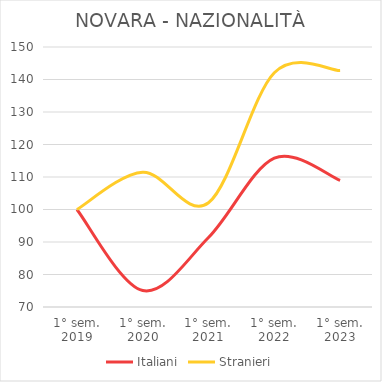
| Category | Italiani | Stranieri |
|---|---|---|
| 1° sem.
2019 | 100 | 100 |
| 1° sem.
2020 | 75.078 | 111.483 |
| 1° sem.
2021 | 91.372 | 102.08 |
| 1° sem.
2022 | 115.792 | 142.074 |
| 1° sem.
2023 | 108.955 | 142.737 |